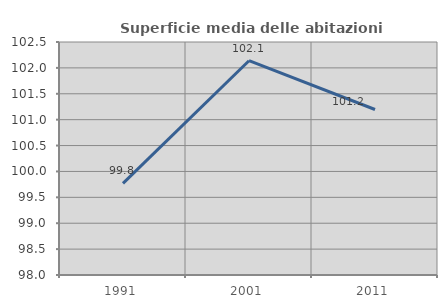
| Category | Superficie media delle abitazioni occupate |
|---|---|
| 1991.0 | 99.769 |
| 2001.0 | 102.139 |
| 2011.0 | 101.196 |